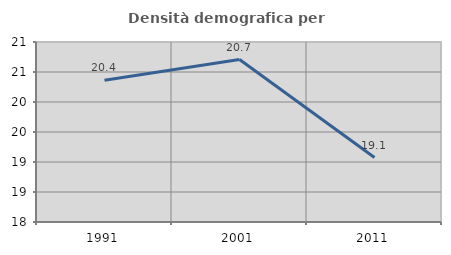
| Category | Densità demografica |
|---|---|
| 1991.0 | 20.362 |
| 2001.0 | 20.708 |
| 2011.0 | 19.074 |